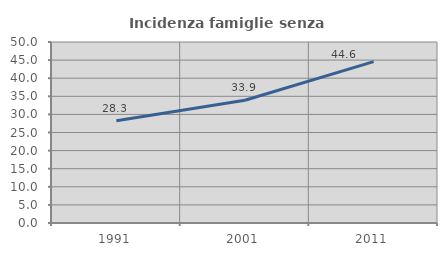
| Category | Incidenza famiglie senza nuclei |
|---|---|
| 1991.0 | 28.254 |
| 2001.0 | 33.892 |
| 2011.0 | 44.576 |